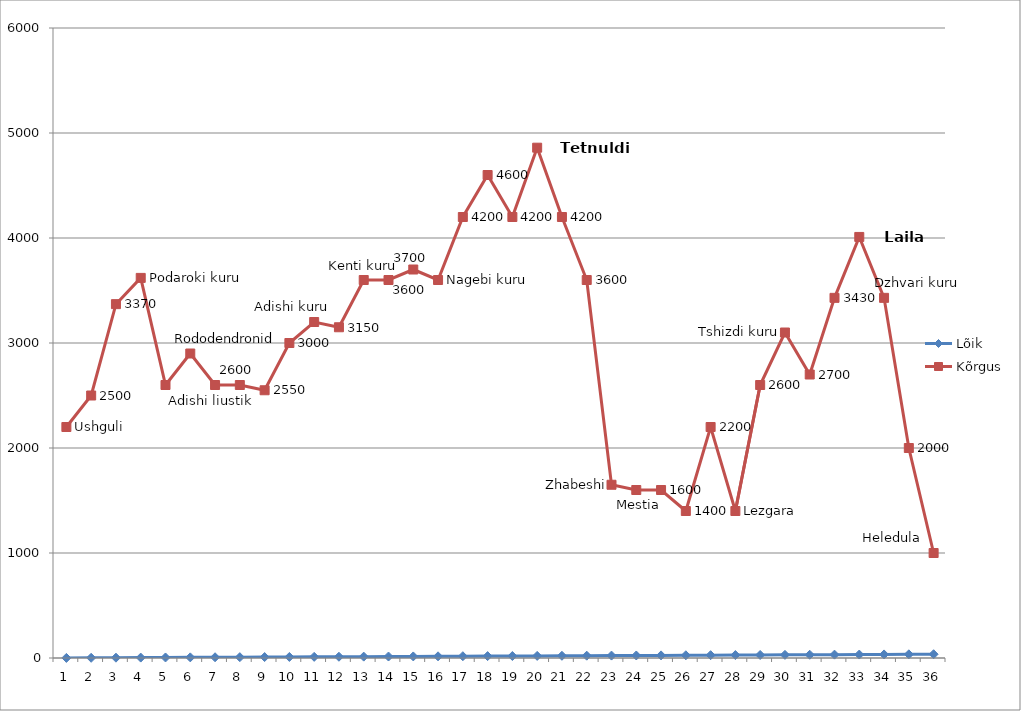
| Category | Lõik | Kõrgus |
|---|---|---|
| 0 | 1 | 2200 |
| 1 | 2 | 2500 |
| 2 | 3 | 3370 |
| 3 | 4 | 3620 |
| 4 | 5 | 2600 |
| 5 | 6 | 2900 |
| 6 | 7 | 2600 |
| 7 | 8 | 2600 |
| 8 | 9 | 2550 |
| 9 | 10 | 3000 |
| 10 | 11 | 3200 |
| 11 | 12 | 3150 |
| 12 | 13 | 3600 |
| 13 | 14 | 3600 |
| 14 | 15 | 3700 |
| 15 | 16 | 3600 |
| 16 | 17 | 4200 |
| 17 | 18 | 4600 |
| 18 | 19 | 4200 |
| 19 | 20 | 4860 |
| 20 | 21 | 4200 |
| 21 | 22 | 3600 |
| 22 | 23 | 1650 |
| 23 | 24 | 1600 |
| 24 | 25 | 1600 |
| 25 | 26 | 1400 |
| 26 | 27 | 2200 |
| 27 | 28 | 1400 |
| 28 | 29 | 2600 |
| 29 | 30 | 3100 |
| 30 | 31 | 2700 |
| 31 | 32 | 3430 |
| 32 | 33 | 4010 |
| 33 | 34 | 3430 |
| 34 | 35 | 2000 |
| 35 | 36 | 1000 |